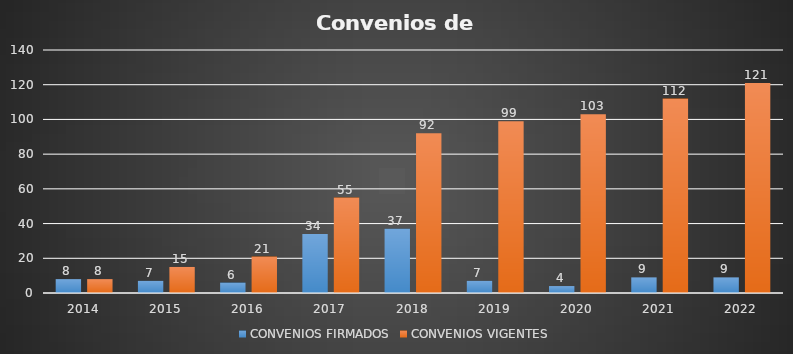
| Category | CONVENIOS FIRMADOS | CONVENIOS VIGENTES |
|---|---|---|
| 2014.0 | 8 | 8 |
| 2015.0 | 7 | 15 |
| 2016.0 | 6 | 21 |
| 2017.0 | 34 | 55 |
| 2018.0 | 37 | 92 |
| 2019.0 | 7 | 99 |
| 2020.0 | 4 | 103 |
| 2021.0 | 9 | 112 |
| 2022.0 | 9 | 121 |